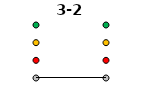
| Category | 0 | 1 | 2 | 3 | 3-2 |
|---|---|---|---|---|---|
| Time 1 | 0 | 1 | 2 | 3 | 0 |
| Time 2 | 0 | 1 | 2 | 3 | 0 |